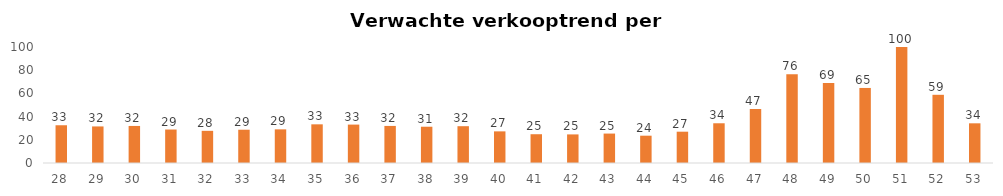
| Category | Series 1 |
|---|---|
| 28.0 | 32.54 |
| 29.0 | 31.52 |
| 30.0 | 31.94 |
| 31.0 | 28.87 |
| 32.0 | 27.73 |
| 33.0 | 28.69 |
| 34.0 | 29.01 |
| 35.0 | 33.34 |
| 36.0 | 33.11 |
| 37.0 | 31.95 |
| 38.0 | 31.27 |
| 39.0 | 31.73 |
| 40.0 | 27.27 |
| 41.0 | 24.81 |
| 42.0 | 24.65 |
| 43.0 | 25.37 |
| 44.0 | 23.54 |
| 45.0 | 26.99 |
| 46.0 | 34.25 |
| 47.0 | 46.57 |
| 48.0 | 76.43 |
| 49.0 | 68.97 |
| 50.0 | 64.69 |
| 51.0 | 100 |
| 52.0 | 58.79 |
| 53.0 | 34.21 |